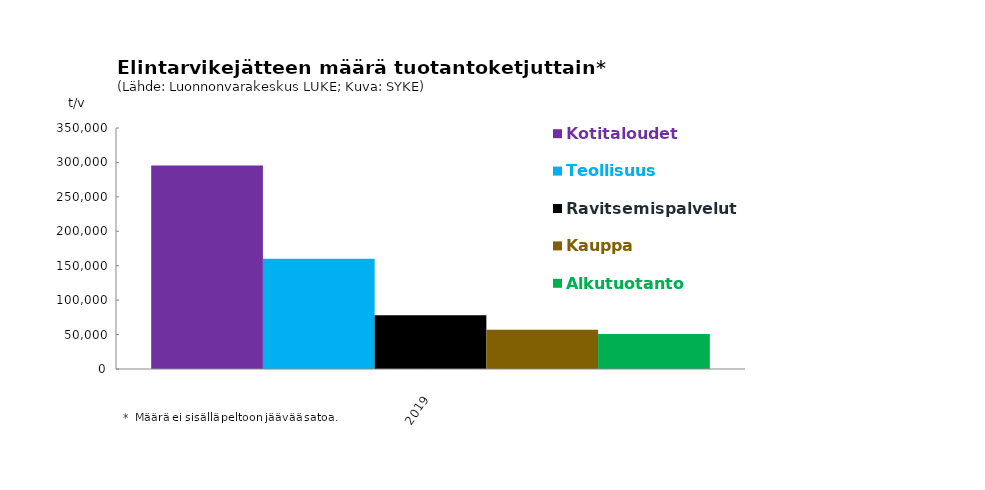
| Category | Kotitaloudet  | Teollisuus  | Ravitsemispalvelut | Kauppa | Alkutuotanto |
|---|---|---|---|---|---|
| 2019.0 | 295500 | 160000 | 78000 | 57000 | 51000 |